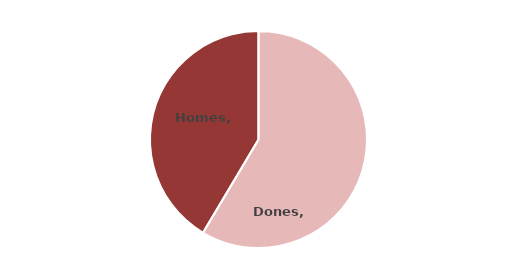
| Category | AMB |
|---|---|
| Dones | 0.585 |
| Homes | 0.415 |